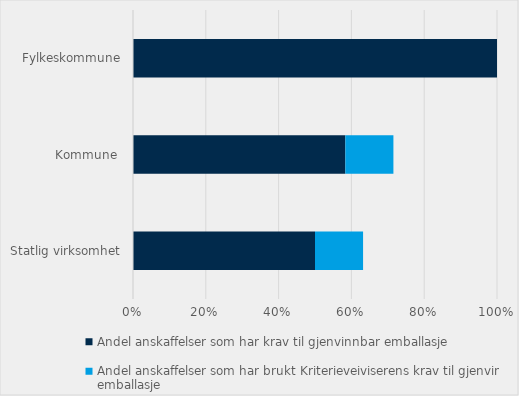
| Category | Andel anskaffelser som har krav til gjenvinnbar emballasje | Andel anskaffelser som har brukt Kriterieveiviserens krav til gjenvinnbar emballasje |
|---|---|---|
| Statlig virksomhet | 0.5 | 0.132 |
| Kommune  | 0.583 | 0.132 |
| Fylkeskommune | 1 | 0 |